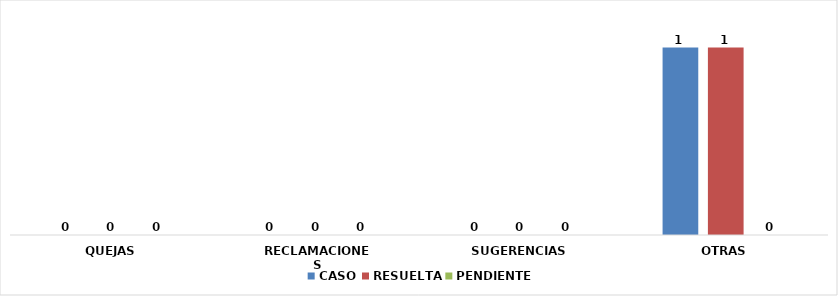
| Category | CASO | RESUELTA | PENDIENTE |
|---|---|---|---|
| QUEJAS | 0 | 0 | 0 |
| RECLAMACIONES | 0 | 0 | 0 |
| SUGERENCIAS | 0 | 0 | 0 |
| OTRAS | 1 | 1 | 0 |